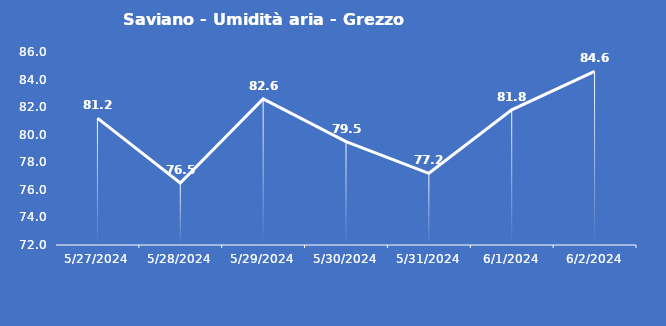
| Category | Saviano - Umidità aria - Grezzo (%) |
|---|---|
| 5/27/24 | 81.2 |
| 5/28/24 | 76.5 |
| 5/29/24 | 82.6 |
| 5/30/24 | 79.5 |
| 5/31/24 | 77.2 |
| 6/1/24 | 81.8 |
| 6/2/24 | 84.6 |